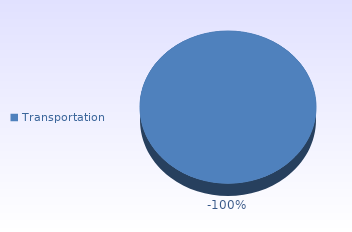
| Category | Series 2 |
|---|---|
| Transportation | -0.001 |